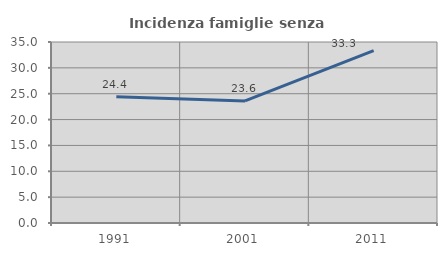
| Category | Incidenza famiglie senza nuclei |
|---|---|
| 1991.0 | 24.412 |
| 2001.0 | 23.607 |
| 2011.0 | 33.333 |